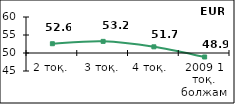
| Category | Диффузионный индекс* |
|---|---|
| 2 тоқ. | 52.575 |
| 3 тоқ. | 53.23 |
| 4 тоқ.  | 51.715 |
| 2009 1 тоқ. болжам | 48.895 |